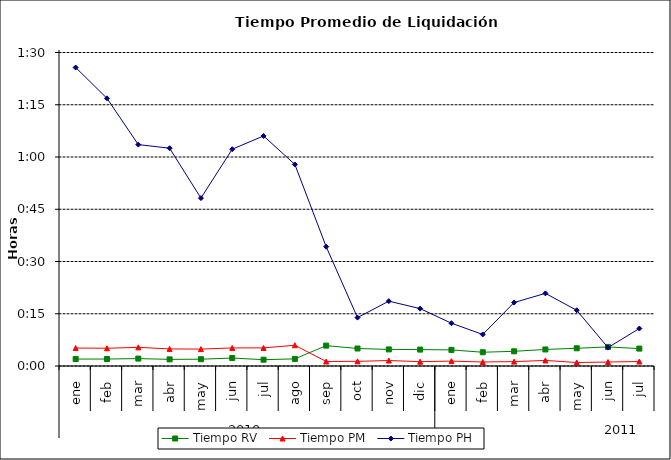
| Category | Tiempo RV | Tiempo PM | Tiempo PH |
|---|---|---|---|
| 0 | 0.001 | 0.004 | 0.06 |
| 1 | 0.001 | 0.004 | 0.053 |
| 2 | 0.001 | 0.004 | 0.044 |
| 3 | 0.001 | 0.003 | 0.043 |
| 4 | 0.001 | 0.003 | 0.033 |
| 5 | 0.002 | 0.004 | 0.043 |
| 6 | 0.001 | 0.004 | 0.046 |
| 7 | 0.001 | 0.004 | 0.04 |
| 8 | 0.004 | 0.001 | 0.024 |
| 9 | 0.003 | 0.001 | 0.01 |
| 10 | 0.003 | 0.001 | 0.013 |
| 11 | 0.003 | 0.001 | 0.011 |
| 12 | 0.003 | 0.001 | 0.009 |
| 13 | 0.003 | 0.001 | 0.006 |
| 14 | 0.003 | 0.001 | 0.013 |
| 15 | 0.003 | 0.001 | 0.014 |
| 16 | 0.004 | 0.001 | 0.011 |
| 17 | 0.004 | 0.001 | 0.004 |
| 18 | 0.003 | 0.001 | 0.007 |